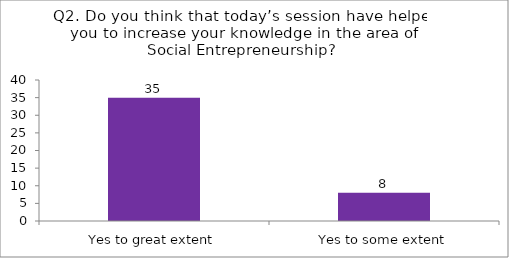
| Category | Q2. Do you think that today’s session have helped you to increase your knowledge in the area of Social Entrepreneurship? |
|---|---|
| Yes to great extent | 35 |
| Yes to some extent | 8 |